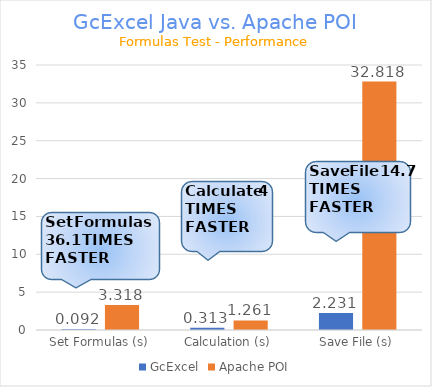
| Category | GcExcel | Apache POI |
|---|---|---|
| Set Formulas (s) | 0.092 | 3.318 |
| Calculation (s) | 0.313 | 1.261 |
| Save File (s) | 2.231 | 32.818 |